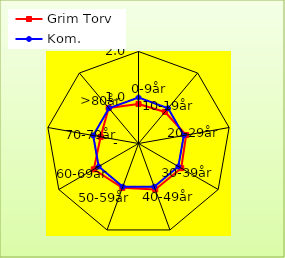
| Category | Grim Torv | Kom. |
|---|---|---|
| 0-9år | 0.858 | 1 |
| 10-19år | 0.895 | 1 |
| 20-29år | 1.052 | 1 |
| 30-39år | 1.072 | 1 |
| 40-49år | 1.064 | 1 |
| 50-59år | 1.026 | 1 |
| 60-69år | 1.122 | 1 |
| 70-79år | 0.835 | 1 |
| >80år | 1.008 | 1 |